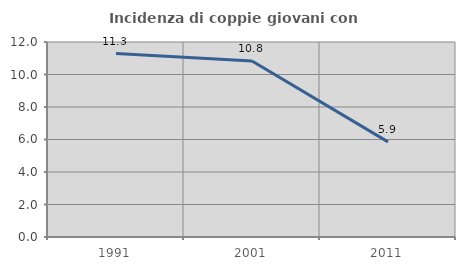
| Category | Incidenza di coppie giovani con figli |
|---|---|
| 1991.0 | 11.29 |
| 2001.0 | 10.829 |
| 2011.0 | 5.853 |